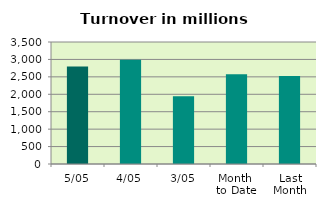
| Category | Series 0 |
|---|---|
| 5/05 | 2795.491 |
| 4/05 | 2992.383 |
| 3/05 | 1945.674 |
| Month 
to Date | 2577.849 |
| Last
Month | 2525.558 |